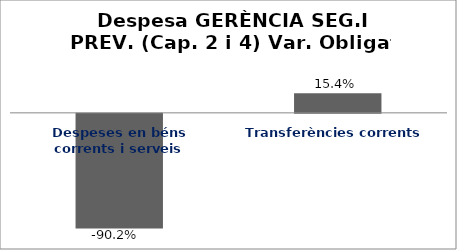
| Category | Series 0 |
|---|---|
| Despeses en béns corrents i serveis | -0.902 |
| Transferències corrents | 0.154 |